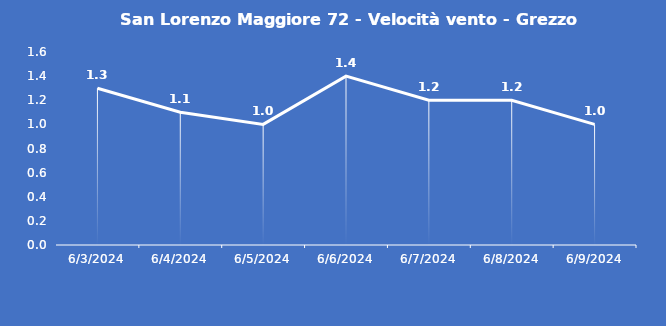
| Category | San Lorenzo Maggiore 72 - Velocità vento - Grezzo (m/s) |
|---|---|
| 6/3/24 | 1.3 |
| 6/4/24 | 1.1 |
| 6/5/24 | 1 |
| 6/6/24 | 1.4 |
| 6/7/24 | 1.2 |
| 6/8/24 | 1.2 |
| 6/9/24 | 1 |